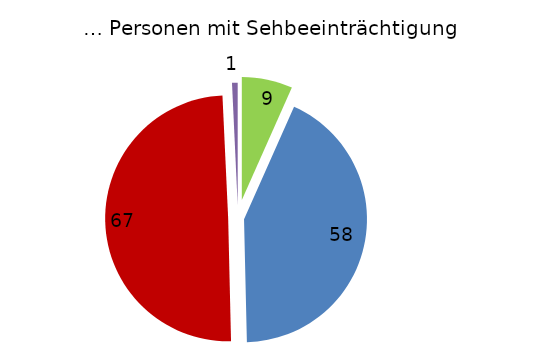
| Category | … Personen mit Sehbeeinträchtigung |
|---|---|
| Auf dem ganzen Campus | 9 |
| Auf Teilen des Campus | 58 |
| Nicht barrierefrei | 67 |
| Keine Angabe | 1 |